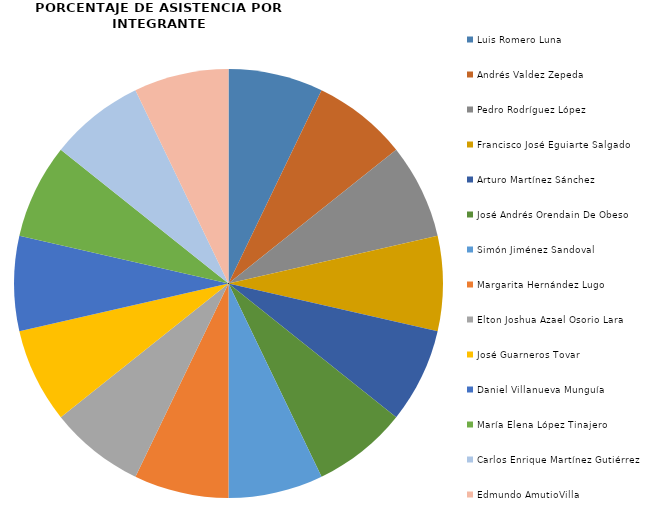
| Category | Series 0 |
|---|---|
| Luis Romero Luna  | 1 |
| Andrés Valdez Zepeda | 1 |
| Pedro Rodríguez López | 1 |
| Francisco José Eguiarte Salgado | 1 |
| Arturo Martínez Sánchez | 1 |
| José Andrés Orendain De Obeso | 1 |
| Simón Jiménez Sandoval | 1 |
| Margarita Hernández Lugo | 1 |
| Elton Joshua Azael Osorio Lara | 1 |
| José Guarneros Tovar | 1 |
| Daniel Villanueva Munguía | 1 |
| María Elena López Tinajero | 1 |
| Carlos Enrique Martínez Gutiérrez | 1 |
| Edmundo AmutioVilla | 1 |